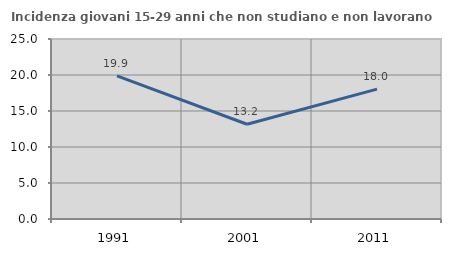
| Category | Incidenza giovani 15-29 anni che non studiano e non lavorano  |
|---|---|
| 1991.0 | 19.891 |
| 2001.0 | 13.158 |
| 2011.0 | 18.033 |